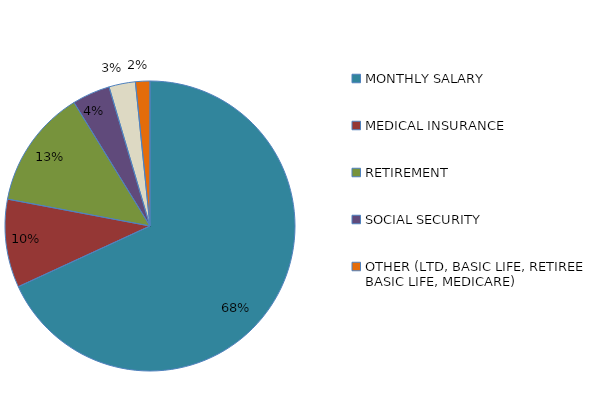
| Category | Series 0 |
|---|---|
| MONTHLY SALARY | 2782.34 |
| MEDICAL INSURANCE | 402 |
| RETIREMENT | 541.165 |
| SOCIAL SECURITY | 172.505 |
| RETIREE MED INS  | 120.475 |
| OTHER (LTD, BASIC LIFE, RETIREE BASIC LIFE, MEDICARE) | 65.663 |